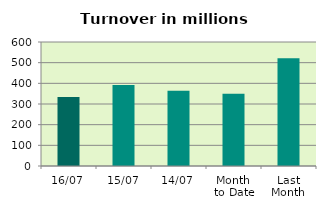
| Category | Series 0 |
|---|---|
| 16/07 | 333.556 |
| 15/07 | 391.834 |
| 14/07 | 364.331 |
| Month 
to Date | 349.012 |
| Last
Month | 521.023 |